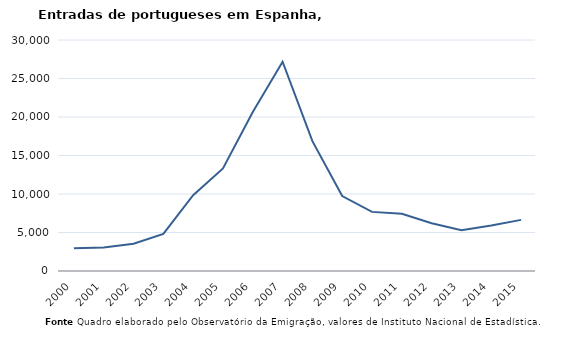
| Category | Entradas |
|---|---|
| 2000.0 | 2968 |
| 2001.0 | 3057 |
| 2002.0 | 3538 |
| 2003.0 | 4825 |
| 2004.0 | 9851 |
| 2005.0 | 13327 |
| 2006.0 | 20658 |
| 2007.0 | 27178 |
| 2008.0 | 16857 |
| 2009.0 | 9739 |
| 2010.0 | 7678 |
| 2011.0 | 7424 |
| 2012.0 | 6201 |
| 2013.0 | 5302 |
| 2014.0 | 5923 |
| 2015.0 | 6638 |